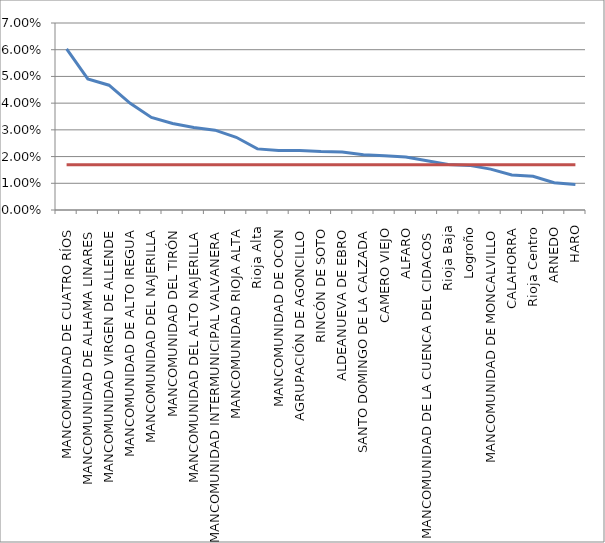
| Category | Series 0 | Series 1 |
|---|---|---|
| MANCOMUNIDAD DE CUATRO RÍOS | 0.06 | 0.017 |
| MANCOMUNIDAD DE ALHAMA LINARES | 0.049 | 0.017 |
| MANCOMUNIDAD VIRGEN DE ALLENDE | 0.047 | 0.017 |
| MANCOMUNIDAD DE ALTO IREGUA | 0.04 | 0.017 |
| MANCOMUNIDAD DEL NAJERILLA | 0.035 | 0.017 |
| MANCOMUNIDAD DEL TIRÓN | 0.032 | 0.017 |
| MANCOMUNIDAD DEL ALTO NAJERILLA | 0.031 | 0.017 |
| MANCOMUNIDAD INTERMUNICIPAL VALVANERA | 0.03 | 0.017 |
| MANCOMUNIDAD RIOJA ALTA | 0.027 | 0.017 |
| Rioja Alta | 0.023 | 0.017 |
| MANCOMUNIDAD DE OCON | 0.022 | 0.017 |
| AGRUPACIÓN DE AGONCILLO | 0.022 | 0.017 |
| RINCÓN DE SOTO | 0.022 | 0.017 |
| ALDEANUEVA DE EBRO | 0.022 | 0.017 |
| SANTO DOMINGO DE LA CALZADA | 0.021 | 0.017 |
| CAMERO VIEJO | 0.02 | 0.017 |
| ALFARO | 0.02 | 0.017 |
| MANCOMUNIDAD DE LA CUENCA DEL CIDACOS | 0.018 | 0.017 |
| Rioja Baja | 0.017 | 0.017 |
| Logroño | 0.017 | 0.017 |
| MANCOMUNIDAD DE MONCALVILLO | 0.015 | 0.017 |
| CALAHORRA | 0.013 | 0.017 |
| Rioja Centro | 0.013 | 0.017 |
| ARNEDO | 0.01 | 0.017 |
| HARO | 0.01 | 0.017 |